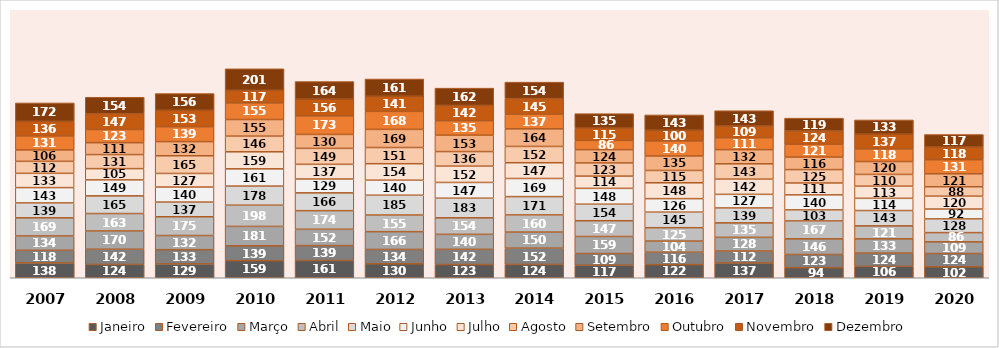
| Category | Janeiro | Fevereiro | Março | Abril | Maio | Junho | Julho | Agosto | Setembro | Outubro | Novembro | Dezembro |
|---|---|---|---|---|---|---|---|---|---|---|---|---|
| 2007 | 138 | 118 | 134 | 169 | 139 | 143 | 133 | 112 | 106 | 131 | 136 | 172 |
| 2008 | 124 | 142 | 170 | 163 | 165 | 149 | 105 | 131 | 111 | 123 | 147 | 154 |
| 2009 | 129 | 133 | 132 | 175 | 137 | 140 | 127 | 165 | 132 | 139 | 153 | 156 |
| 2010 | 159 | 139 | 181 | 198 | 178 | 161 | 159 | 146 | 155 | 155 | 117 | 201 |
| 2011 | 161 | 139 | 152 | 174 | 166 | 129 | 137 | 149 | 130 | 173 | 156 | 164 |
| 2012 | 130 | 134 | 166 | 155 | 185 | 140 | 154 | 151 | 169 | 168 | 141 | 161 |
| 2013 | 123 | 142 | 140 | 154 | 183 | 147 | 152 | 136 | 153 | 135 | 142 | 162 |
| 2014 | 124 | 152 | 150 | 160 | 171 | 169 | 147 | 152 | 164 | 137 | 145 | 154 |
| 2015 | 117 | 109 | 159 | 147 | 154 | 148 | 114 | 123 | 124 | 86 | 115 | 135 |
| 2016 | 122 | 116 | 104 | 125 | 145 | 126 | 148 | 115 | 135 | 140 | 100 | 143 |
| 2017 | 137 | 112 | 128 | 135 | 139 | 127 | 142 | 143 | 132 | 111 | 109 | 143 |
| 2018 | 94 | 123 | 146 | 167 | 103 | 140 | 111 | 125 | 116 | 121 | 124 | 119 |
| 2019 | 106 | 124 | 133 | 121 | 143 | 114 | 113 | 110 | 120 | 118 | 137 | 133 |
| 2020 | 102 | 124 | 109 | 86 | 128 | 92 | 120 | 88 | 121 | 131 | 118 | 117 |